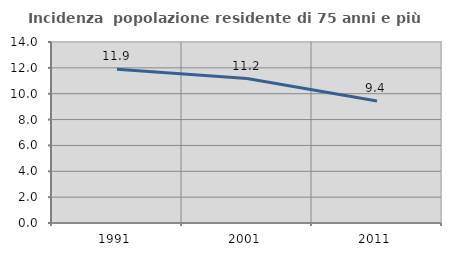
| Category | Incidenza  popolazione residente di 75 anni e più |
|---|---|
| 1991.0 | 11.899 |
| 2001.0 | 11.172 |
| 2011.0 | 9.431 |